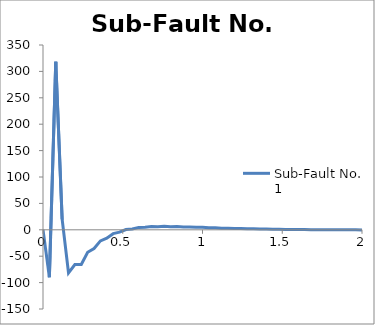
| Category | Sub-Fault No.  1 |
|---|---|
| 0.0 | 0 |
| 0.04 | -89.864 |
| 0.08 | 318.28 |
| 0.12 | 20.042 |
| 0.16 | -81.64 |
| 0.2 | -65.915 |
| 0.24 | -65.609 |
| 0.28 | -42.628 |
| 0.32 | -35.382 |
| 0.36 | -20.973 |
| 0.4 | -15.879 |
| 0.44 | -7.307 |
| 0.48 | -4.512 |
| 0.52 | 0.495 |
| 0.56 | 1.69 |
| 0.6 | 4.524 |
| 0.64 | 4.723 |
| 0.68 | 6.241 |
| 0.72 | 5.871 |
| 0.76 | 6.609 |
| 0.8 | 5.95 |
| 0.84 | 6.24 |
| 0.88 | 5.467 |
| 0.92 | 5.516 |
| 0.96 | 4.732 |
| 1.0 | 4.664 |
| 1.04 | 3.927 |
| 1.08 | 3.814 |
| 1.12 | 3.151 |
| 1.16 | 3.034 |
| 1.2 | 2.454 |
| 1.24 | 2.354 |
| 1.28 | 1.857 |
| 1.32 | 1.782 |
| 1.36 | 1.361 |
| 1.4 | 1.313 |
| 1.44 | 0.96 |
| 1.48 | 0.937 |
| 1.52 | 0.643 |
| 1.56 | 0.642 |
| 1.6 | 0.397 |
| 1.64 | 0.415 |
| 1.68 | 0.211 |
| 1.72 | 0.242 |
| 1.76 | 0.072 |
| 1.8 | 0.113 |
| 1.84 | -0.029 |
| 1.88 | 0.02 |
| 1.92 | -0.101 |
| 1.96 | -0.046 |
| 2.0 | -0.149 |
| 2.04 | -0.092 |
| 2.08 | -0.179 |
| 2.12 | -0.121 |
| 2.16 | -0.197 |
| 2.2 | -0.138 |
| 2.24 | -0.205 |
| 2.28 | -0.147 |
| 2.32 | -0.206 |
| 2.36 | -0.149 |
| 2.4 | -0.202 |
| 2.44 | -0.147 |
| 2.48 | -0.194 |
| 2.52 | -0.142 |
| 2.56 | -0.185 |
| 2.6 | -0.135 |
| 2.64 | -0.174 |
| 2.68 | -0.127 |
| 2.72 | -0.163 |
| 2.76 | -0.118 |
| 2.8 | -0.151 |
| 2.84 | -0.108 |
| 2.88 | -0.14 |
| 2.92 | -0.099 |
| 2.96 | -0.129 |
| 3.0 | -0.09 |
| 3.04 | -0.118 |
| 3.08 | -0.082 |
| 3.12 | -0.108 |
| 3.16 | -0.074 |
| 3.2 | -0.099 |
| 3.24 | -0.066 |
| 3.28 | -0.09 |
| 3.32 | -0.06 |
| 3.36 | -0.082 |
| 3.4 | -0.053 |
| 3.44 | -0.075 |
| 3.48 | -0.047 |
| 3.52 | -0.068 |
| 3.56 | -0.042 |
| 3.6 | -0.062 |
| 3.64 | -0.037 |
| 3.68 | -0.056 |
| 3.72 | -0.033 |
| 3.76 | -0.051 |
| 3.8 | -0.029 |
| 3.84 | -0.047 |
| 3.88 | -0.025 |
| 3.92 | -0.042 |
| 3.96 | -0.022 |
| 4.0 | -0.038 |
| 4.04 | -0.019 |
| 4.08 | -0.035 |
| 4.12 | -0.017 |
| 4.16 | -0.032 |
| 4.2 | -0.014 |
| 4.24 | -0.029 |
| 4.28 | -0.012 |
| 4.32 | -0.026 |
| 4.36 | -0.011 |
| 4.4 | -0.024 |
| 4.44 | -0.009 |
| 4.48 | -0.022 |
| 4.52 | -0.007 |
| 4.56 | -0.02 |
| 4.6 | -0.006 |
| 4.64 | -0.018 |
| 4.68 | -0.005 |
| 4.72 | -0.016 |
| 4.76 | 0 |
| 4.8 | 0 |
| 4.84 | 0 |
| 4.88 | 0 |
| 4.92 | 0 |
| 4.96 | 0 |
| 5.0 | 0 |
| 5.04 | 0 |
| 5.08 | 0 |
| 5.12 | 0 |
| 5.16 | 0 |
| 5.2 | 0 |
| 5.24 | 0 |
| 5.28 | 0 |
| 5.32 | 0 |
| 5.36 | 0 |
| 5.4 | 0 |
| 5.44 | 0 |
| 5.48 | 0 |
| 5.52 | 0 |
| 5.56 | 0 |
| 5.6 | 0 |
| 5.64 | 0 |
| 5.68 | 0 |
| 5.72 | 0 |
| 5.76 | 0 |
| 5.8 | 0 |
| 5.84 | 0 |
| 5.88 | 0 |
| 5.92 | 0 |
| 5.96 | 0 |
| 6.0 | 0 |
| 6.04 | 0 |
| 6.08 | 0 |
| 6.12 | 0 |
| 6.16 | 0 |
| 6.2 | 0 |
| 6.24 | 0 |
| 6.28 | 0 |
| 6.32 | 0 |
| 6.36 | 0 |
| 6.4 | 0 |
| 6.44 | 0 |
| 6.48 | 0 |
| 6.52 | 0 |
| 6.56 | 0 |
| 6.6 | 0 |
| 6.64 | 0 |
| 6.68 | 0 |
| 6.72 | 0 |
| 6.76 | 0 |
| 6.8 | 0 |
| 6.84 | 0 |
| 6.88 | 0 |
| 6.92 | 0 |
| 6.96 | 0 |
| 7.0 | 0 |
| 7.04 | 0 |
| 7.08 | 0 |
| 7.12 | 0 |
| 7.16 | 0 |
| 7.2 | 0 |
| 7.24 | 0 |
| 7.28 | 0 |
| 7.32 | 0 |
| 7.36 | 0 |
| 7.4 | 0 |
| 7.44 | 0 |
| 7.48 | 0 |
| 7.52 | 0 |
| 7.56 | 0 |
| 7.6 | 0 |
| 7.64 | 0 |
| 7.68 | 0 |
| 7.72 | 0 |
| 7.76 | 0 |
| 7.8 | 0 |
| 7.84 | 0 |
| 7.88 | 0 |
| 7.92 | 0 |
| 7.96 | 0 |
| 8.0 | 0 |
| 8.04 | 0 |
| 8.08 | 0 |
| 8.12 | 0 |
| 8.16 | 0 |
| 8.2 | 0 |
| 8.24 | 0 |
| 8.28 | 0 |
| 8.32 | 0 |
| 8.36 | 0 |
| 8.4 | 0 |
| 8.44 | 0 |
| 8.48 | 0 |
| 8.52 | 0 |
| 8.56 | 0 |
| 8.6 | 0 |
| 8.64 | 0 |
| 8.68 | 0 |
| 8.72 | 0 |
| 8.76 | 0 |
| 8.8 | 0 |
| 8.84 | 0 |
| 8.88 | 0 |
| 8.92 | 0 |
| 8.96 | 0 |
| 9.0 | 0 |
| 9.04 | 0 |
| 9.08 | 0 |
| 9.12 | 0 |
| 9.16 | 0 |
| 9.2 | 0 |
| 9.24 | 0 |
| 9.28 | 0 |
| 9.32 | 0 |
| 9.36 | 0 |
| 9.4 | 0 |
| 9.44 | 0 |
| 9.48 | 0 |
| 9.52 | 0 |
| 9.56 | 0 |
| 9.6 | 0 |
| 9.64 | 0 |
| 9.68 | 0 |
| 9.72 | 0 |
| 9.76 | 0 |
| 9.8 | 0 |
| 9.84 | 0 |
| 9.88 | 0 |
| 9.92 | 0 |
| 9.96 | 0 |
| 10.0 | 0 |
| 10.04 | 0 |
| 10.08 | 0 |
| 10.12 | 0 |
| 10.16 | 0 |
| 10.2 | 0 |
| 10.24 | 0 |
| 10.28 | 0 |
| 10.32 | 0 |
| 10.36 | 0 |
| 10.4 | 0 |
| 10.44 | 0 |
| 10.48 | 0 |
| 10.52 | 0 |
| 10.56 | 0 |
| 10.6 | 0 |
| 10.64 | 0 |
| 10.68 | 0 |
| 10.72 | 0 |
| 10.76 | 0 |
| 10.8 | 0 |
| 10.84 | 0 |
| 10.88 | 0 |
| 10.92 | 0 |
| 10.96 | 0 |
| 11.0 | 0 |
| 11.04 | 0 |
| 11.08 | 0 |
| 11.12 | 0 |
| 11.16 | 0 |
| 11.2 | 0 |
| 11.24 | 0 |
| 11.28 | 0 |
| 11.32 | 0 |
| 11.36 | 0 |
| 11.4 | 0 |
| 11.44 | 0 |
| 11.48 | 0 |
| 11.52 | 0 |
| 11.56 | 0 |
| 11.6 | 0 |
| 11.64 | 0 |
| 11.68 | 0 |
| 11.72 | 0 |
| 11.76 | 0 |
| 11.8 | 0 |
| 11.84 | 0 |
| 11.88 | 0 |
| 11.92 | 0 |
| 11.96 | 0 |
| 12.0 | 0 |
| 12.04 | 0 |
| 12.08 | 0 |
| 12.12 | 0 |
| 12.16 | 0 |
| 12.2 | 0 |
| 12.24 | 0 |
| 12.28 | 0 |
| 12.32 | 0 |
| 12.36 | 0 |
| 12.4 | 0 |
| 12.44 | 0 |
| 12.48 | 0 |
| 12.52 | 0 |
| 12.56 | 0 |
| 12.6 | 0 |
| 12.64 | 0 |
| 12.68 | 0 |
| 12.72 | 0 |
| 12.76 | 0 |
| 12.8 | 0 |
| 12.84 | 0 |
| 12.88 | 0 |
| 12.92 | 0 |
| 12.96 | 0 |
| 13.0 | 0 |
| 13.04 | 0 |
| 13.08 | 0 |
| 13.12 | 0 |
| 13.16 | 0 |
| 13.2 | 0 |
| 13.24 | 0 |
| 13.28 | 0 |
| 13.32 | 0 |
| 13.36 | 0 |
| 13.4 | 0 |
| 13.44 | 0 |
| 13.48 | 0 |
| 13.52 | 0 |
| 13.56 | 0 |
| 13.6 | 0 |
| 13.64 | 0 |
| 13.68 | 0 |
| 13.72 | 0 |
| 13.76 | 0 |
| 13.8 | 0 |
| 13.84 | 0 |
| 13.88 | 0 |
| 13.92 | 0 |
| 13.96 | 0 |
| 14.0 | 0 |
| 14.04 | 0 |
| 14.08 | 0 |
| 14.12 | 0 |
| 14.16 | 0 |
| 14.2 | 0 |
| 14.24 | 0 |
| 14.28 | 0 |
| 14.32 | 0 |
| 14.36 | 0 |
| 14.4 | 0 |
| 14.44 | 0 |
| 14.48 | 0 |
| 14.52 | 0 |
| 14.56 | 0 |
| 14.6 | 0 |
| 14.64 | 0 |
| 14.68 | 0 |
| 14.72 | 0 |
| 14.76 | 0 |
| 14.8 | 0 |
| 14.84 | 0 |
| 14.88 | 0 |
| 14.92 | 0 |
| 14.96 | 0 |
| 15.0 | 0 |
| 15.04 | 0 |
| 15.08 | 0 |
| 15.12 | 0 |
| 15.16 | 0 |
| 15.2 | 0 |
| 15.24 | 0 |
| 15.28 | 0 |
| 15.32 | 0 |
| 15.36 | 0 |
| 15.4 | 0 |
| 15.44 | 0 |
| 15.48 | 0 |
| 15.52 | 0 |
| 15.56 | 0 |
| 15.6 | 0 |
| 15.64 | 0 |
| 15.68 | 0 |
| 15.72 | 0 |
| 15.76 | 0 |
| 15.8 | 0 |
| 15.84 | 0 |
| 15.88 | 0 |
| 15.92 | 0 |
| 15.96 | 0 |
| 16.0 | 0 |
| 16.04 | 0 |
| 16.08 | 0 |
| 16.12 | 0 |
| 16.16 | 0 |
| 16.2 | 0 |
| 16.24 | 0 |
| 16.28 | 0 |
| 16.32 | 0 |
| 16.36 | 0 |
| 16.4 | 0 |
| 16.44 | 0 |
| 16.48 | 0 |
| 16.52 | 0 |
| 16.56 | 0 |
| 16.6 | 0 |
| 16.64 | 0 |
| 16.68 | 0 |
| 16.72 | 0 |
| 16.76 | 0 |
| 16.8 | 0 |
| 16.84 | 0 |
| 16.88 | 0 |
| 16.92 | 0 |
| 16.96 | 0 |
| 17.0 | 0 |
| 17.04 | 0 |
| 17.08 | 0 |
| 17.12 | 0 |
| 17.16 | 0 |
| 17.2 | 0 |
| 17.24 | 0 |
| 17.28 | 0 |
| 17.32 | 0 |
| 17.36 | 0 |
| 17.4 | 0 |
| 17.44 | 0 |
| 17.48 | 0 |
| 17.52 | 0 |
| 17.56 | 0 |
| 17.6 | 0 |
| 17.64 | 0 |
| 17.68 | 0 |
| 17.72 | 0 |
| 17.76 | 0 |
| 17.8 | 0 |
| 17.84 | 0 |
| 17.88 | 0 |
| 17.92 | 0 |
| 17.96 | 0 |
| 18.0 | 0 |
| 18.04 | 0 |
| 18.08 | 0 |
| 18.12 | 0 |
| 18.16 | 0 |
| 18.2 | 0 |
| 18.24 | 0 |
| 18.28 | 0 |
| 18.32 | 0 |
| 18.36 | 0 |
| 18.4 | 0 |
| 18.44 | 0 |
| 18.48 | 0 |
| 18.52 | 0 |
| 18.56 | 0 |
| 18.6 | 0 |
| 18.64 | 0 |
| 18.68 | 0 |
| 18.72 | 0 |
| 18.76 | 0 |
| 18.8 | 0 |
| 18.84 | 0 |
| 18.88 | 0 |
| 18.92 | 0 |
| 18.96 | 0 |
| 19.0 | 0 |
| 19.04 | 0 |
| 19.08 | 0 |
| 19.12 | 0 |
| 19.16 | 0 |
| 19.2 | 0 |
| 19.24 | 0 |
| 19.28 | 0 |
| 19.32 | 0 |
| 19.36 | 0 |
| 19.4 | 0 |
| 19.44 | 0 |
| 19.48 | 0 |
| 19.52 | 0 |
| 19.56 | 0 |
| 19.6 | 0 |
| 19.64 | 0 |
| 19.68 | 0 |
| 19.72 | 0 |
| 19.76 | 0 |
| 19.8 | 0 |
| 19.84 | 0 |
| 19.88 | 0 |
| 19.92 | 0 |
| 19.96 | 0 |
| 20.0 | 0 |
| 20.04 | 0 |
| 20.08 | 0 |
| 20.12 | 0 |
| 20.16 | 0 |
| 20.2 | 0 |
| 20.24 | 0 |
| 20.28 | 0 |
| 20.32 | 0 |
| 20.36 | 0 |
| 20.4 | 0 |
| 20.44 | 0 |
| 20.48 | 0 |
| 20.52 | 0 |
| 20.56 | 0 |
| 20.6 | 0 |
| 20.64 | 0 |
| 20.68 | 0 |
| 20.72 | 0 |
| 20.76 | 0 |
| 20.8 | 0 |
| 20.84 | 0 |
| 20.88 | 0 |
| 20.92 | 0 |
| 20.96 | 0 |
| 21.0 | 0 |
| 21.04 | 0 |
| 21.08 | 0 |
| 21.12 | 0 |
| 21.16 | 0 |
| 21.2 | 0 |
| 21.24 | 0 |
| 21.28 | 0 |
| 21.32 | 0 |
| 21.36 | 0 |
| 21.4 | 0 |
| 21.44 | 0 |
| 21.48 | 0 |
| 21.52 | 0 |
| 21.56 | 0 |
| 21.6 | 0 |
| 21.64 | 0 |
| 21.68 | 0 |
| 21.72 | 0 |
| 21.76 | 0 |
| 21.8 | 0 |
| 21.84 | 0 |
| 21.88 | 0 |
| 21.92 | 0 |
| 21.96 | 0 |
| 22.0 | 0 |
| 22.04 | 0 |
| 22.08 | 0 |
| 22.12 | 0 |
| 22.16 | 0 |
| 22.2 | 0 |
| 22.24 | 0 |
| 22.28 | 0 |
| 22.32 | 0 |
| 22.36 | 0 |
| 22.4 | 0 |
| 22.44 | 0 |
| 22.48 | 0 |
| 22.52 | 0 |
| 22.56 | 0 |
| 22.6 | 0 |
| 22.64 | 0 |
| 22.68 | 0 |
| 22.72 | 0 |
| 22.76 | 0 |
| 22.8 | 0 |
| 22.84 | 0 |
| 22.88 | 0 |
| 22.92 | 0 |
| 22.96 | 0 |
| 23.0 | 0 |
| 23.04 | 0 |
| 23.08 | 0 |
| 23.12 | 0 |
| 23.16 | 0 |
| 23.2 | 0 |
| 23.24 | 0 |
| 23.28 | 0 |
| 23.32 | 0 |
| 23.36 | 0 |
| 23.4 | 0 |
| 23.44 | 0 |
| 23.48 | 0 |
| 23.52 | 0 |
| 23.56 | 0 |
| 23.6 | 0 |
| 23.64 | 0 |
| 23.68 | 0 |
| 23.72 | 0 |
| 23.76 | 0 |
| 23.8 | 0 |
| 23.84 | 0 |
| 23.88 | 0 |
| 23.92 | 0 |
| 23.96 | 0 |
| 24.0 | 0 |
| 24.04 | 0 |
| 24.08 | 0 |
| 24.12 | 0 |
| 24.16 | 0 |
| 24.2 | 0 |
| 24.24 | 0 |
| 24.28 | 0 |
| 24.32 | 0 |
| 24.36 | 0 |
| 24.4 | 0 |
| 24.44 | 0 |
| 24.48 | 0 |
| 24.52 | 0 |
| 24.56 | 0 |
| 24.6 | 0 |
| 24.64 | 0 |
| 24.68 | 0 |
| 24.72 | 0 |
| 24.76 | 0 |
| 24.8 | 0 |
| 24.84 | 0 |
| 24.88 | 0 |
| 24.92 | 0 |
| 24.96 | 0 |
| 25.0 | 0 |
| 25.04 | 0 |
| 25.08 | 0 |
| 25.12 | 0 |
| 25.16 | 0 |
| 25.2 | 0 |
| 25.24 | 0 |
| 25.28 | 0 |
| 25.32 | 0 |
| 25.36 | 0 |
| 25.4 | 0 |
| 25.44 | 0 |
| 25.48 | 0 |
| 25.52 | 0 |
| 25.56 | 0 |
| 25.6 | 0 |
| 25.64 | 0 |
| 25.68 | 0 |
| 25.72 | 0 |
| 25.76 | 0 |
| 25.8 | 0 |
| 25.84 | 0 |
| 25.88 | 0 |
| 25.92 | 0 |
| 25.96 | 0 |
| 26.0 | 0 |
| 26.04 | 0 |
| 26.08 | 0 |
| 26.12 | 0 |
| 26.16 | 0 |
| 26.2 | 0 |
| 26.24 | 0 |
| 26.28 | 0 |
| 26.32 | 0 |
| 26.36 | 0 |
| 26.4 | 0 |
| 26.44 | 0 |
| 26.48 | 0 |
| 26.52 | 0 |
| 26.56 | 0 |
| 26.6 | 0 |
| 26.64 | 0 |
| 26.68 | 0 |
| 26.72 | 0 |
| 26.76 | 0 |
| 26.8 | 0 |
| 26.84 | 0 |
| 26.88 | 0 |
| 26.92 | 0 |
| 26.96 | 0 |
| 27.0 | 0 |
| 27.04 | 0 |
| 27.08 | 0 |
| 27.12 | 0 |
| 27.16 | 0 |
| 27.2 | 0 |
| 27.24 | 0 |
| 27.28 | 0 |
| 27.32 | 0 |
| 27.36 | 0 |
| 27.4 | 0 |
| 27.44 | 0 |
| 27.48 | 0 |
| 27.52 | 0 |
| 27.56 | 0 |
| 27.6 | 0 |
| 27.64 | 0 |
| 27.68 | 0 |
| 27.72 | 0 |
| 27.76 | 0 |
| 27.8 | 0 |
| 27.84 | 0 |
| 27.88 | 0 |
| 27.92 | 0 |
| 27.96 | 0 |
| 28.0 | 0 |
| 28.04 | 0 |
| 28.08 | 0 |
| 28.12 | 0 |
| 28.16 | 0 |
| 28.2 | 0 |
| 28.24 | 0 |
| 28.28 | 0 |
| 28.32 | 0 |
| 28.36 | 0 |
| 28.4 | 0 |
| 28.44 | 0 |
| 28.48 | 0 |
| 28.52 | 0 |
| 28.56 | 0 |
| 28.6 | 0 |
| 28.64 | 0 |
| 28.68 | 0 |
| 28.72 | 0 |
| 28.76 | 0 |
| 28.8 | 0 |
| 28.84 | 0 |
| 28.88 | 0 |
| 28.92 | 0 |
| 28.96 | 0 |
| 29.0 | 0 |
| 29.04 | 0 |
| 29.08 | 0 |
| 29.12 | 0 |
| 29.16 | 0 |
| 29.2 | 0 |
| 29.24 | 0 |
| 29.28 | 0 |
| 29.32 | 0 |
| 29.36 | 0 |
| 29.4 | 0 |
| 29.44 | 0 |
| 29.48 | 0 |
| 29.52 | 0 |
| 29.56 | 0 |
| 29.6 | 0 |
| 29.64 | 0 |
| 29.68 | 0 |
| 29.72 | 0 |
| 29.76 | 0 |
| 29.8 | 0 |
| 29.84 | 0 |
| 29.88 | 0 |
| 29.92 | 0 |
| 29.96 | 0 |
| 30.0 | 0 |
| 30.04 | 0 |
| 30.08 | 0 |
| 30.12 | 0 |
| 30.16 | 0 |
| 30.2 | 0 |
| 30.24 | 0 |
| 30.28 | 0 |
| 30.32 | 0 |
| 30.36 | 0 |
| 30.4 | 0 |
| 30.44 | 0 |
| 30.48 | 0 |
| 30.52 | 0 |
| 30.56 | 0 |
| 30.6 | 0 |
| 30.64 | 0 |
| 30.68 | 0 |
| 30.72 | 0 |
| 30.76 | 0 |
| 30.8 | 0 |
| 30.84 | 0 |
| 30.88 | 0 |
| 30.92 | 0 |
| 30.96 | 0 |
| 31.0 | 0 |
| 31.04 | 0 |
| 31.08 | 0 |
| 31.12 | 0 |
| 31.16 | 0 |
| 31.2 | 0 |
| 31.24 | 0 |
| 31.28 | 0 |
| 31.32 | 0 |
| 31.36 | 0 |
| 31.4 | 0 |
| 31.44 | 0 |
| 31.48 | 0 |
| 31.52 | 0 |
| 31.56 | 0 |
| 31.6 | 0 |
| 31.64 | 0 |
| 31.68 | 0 |
| 31.72 | 0 |
| 31.76 | 0 |
| 31.8 | 0 |
| 31.84 | 0 |
| 31.88 | 0 |
| 31.92 | 0 |
| 31.96 | 0 |
| 32.0 | 0 |
| 32.04 | 0 |
| 32.08 | 0 |
| 32.12 | 0 |
| 32.16 | 0 |
| 32.2 | 0 |
| 32.24 | 0 |
| 32.28 | 0 |
| 32.32 | 0 |
| 32.36 | 0 |
| 32.4 | 0 |
| 32.44 | 0 |
| 32.48 | 0 |
| 32.52 | 0 |
| 32.56 | 0 |
| 32.6 | 0 |
| 32.64 | 0 |
| 32.68 | 0 |
| 32.72 | 0 |
| 32.76 | 0 |
| 32.8 | 0 |
| 32.84 | 0 |
| 32.88 | 0 |
| 32.92 | 0 |
| 32.96 | 0 |
| 33.0 | 0 |
| 33.04 | 0 |
| 33.08 | 0 |
| 33.12 | 0 |
| 33.16 | 0 |
| 33.2 | 0 |
| 33.24 | 0 |
| 33.28 | 0 |
| 33.32 | 0 |
| 33.36 | 0 |
| 33.4 | 0 |
| 33.44 | 0 |
| 33.48 | 0 |
| 33.52 | 0 |
| 33.56 | 0 |
| 33.6 | 0 |
| 33.64 | 0 |
| 33.68 | 0 |
| 33.72 | 0 |
| 33.76 | 0 |
| 33.8 | 0 |
| 33.84 | 0 |
| 33.88 | 0 |
| 33.92 | 0 |
| 33.96 | 0 |
| 34.0 | 0 |
| 34.04 | 0 |
| 34.08 | 0 |
| 34.12 | 0 |
| 34.16 | 0 |
| 34.2 | 0 |
| 34.24 | 0 |
| 34.28 | 0 |
| 34.32 | 0 |
| 34.36 | 0 |
| 34.4 | 0 |
| 34.44 | 0 |
| 34.48 | 0 |
| 34.52 | 0 |
| 34.56 | 0 |
| 34.6 | 0 |
| 34.64 | 0 |
| 34.68 | 0 |
| 34.72 | 0 |
| 34.76 | 0 |
| 34.8 | 0 |
| 34.84 | 0 |
| 34.88 | 0 |
| 34.92 | 0 |
| 34.96 | 0 |
| 35.0 | 0 |
| 35.04 | 0 |
| 35.08 | 0 |
| 35.12 | 0 |
| 35.16 | 0 |
| 35.2 | 0 |
| 35.24 | 0 |
| 35.28 | 0 |
| 35.32 | 0 |
| 35.36 | 0 |
| 35.4 | 0 |
| 35.44 | 0 |
| 35.48 | 0 |
| 35.52 | 0 |
| 35.56 | 0 |
| 35.6 | 0 |
| 35.64 | 0 |
| 35.68 | 0 |
| 35.72 | 0 |
| 35.76 | 0 |
| 35.8 | 0 |
| 35.84 | 0 |
| 35.88 | 0 |
| 35.92 | 0 |
| 35.96 | 0 |
| 36.0 | 0 |
| 36.04 | 0 |
| 36.08 | 0 |
| 36.12 | 0 |
| 36.16 | 0 |
| 36.2 | 0 |
| 36.24 | 0 |
| 36.28 | 0 |
| 36.32 | 0 |
| 36.36 | 0 |
| 36.4 | 0 |
| 36.44 | 0 |
| 36.48 | 0 |
| 36.52 | 0 |
| 36.56 | 0 |
| 36.6 | 0 |
| 36.64 | 0 |
| 36.68 | 0 |
| 36.72 | 0 |
| 36.76 | 0 |
| 36.8 | 0 |
| 36.84 | 0 |
| 36.88 | 0 |
| 36.92 | 0 |
| 36.96 | 0 |
| 37.0 | 0 |
| 37.04 | 0 |
| 37.08 | 0 |
| 37.12 | 0 |
| 37.16 | 0 |
| 37.2 | 0 |
| 37.24 | 0 |
| 37.28 | 0 |
| 37.32 | 0 |
| 37.36 | 0 |
| 37.4 | 0 |
| 37.44 | 0 |
| 37.48 | 0 |
| 37.52 | 0 |
| 37.56 | 0 |
| 37.6 | 0 |
| 37.64 | 0 |
| 37.68 | 0 |
| 37.72 | 0 |
| 37.76 | 0 |
| 37.8 | 0 |
| 37.84 | 0 |
| 37.88 | 0 |
| 37.92 | 0 |
| 37.96 | 0 |
| 38.0 | 0 |
| 38.04 | 0 |
| 38.08 | 0 |
| 38.12 | 0 |
| 38.16 | 0 |
| 38.2 | 0 |
| 38.24 | 0 |
| 38.28 | 0 |
| 38.32 | 0 |
| 38.36 | 0 |
| 38.4 | 0 |
| 38.44 | 0 |
| 38.48 | 0 |
| 38.52 | 0 |
| 38.56 | 0 |
| 38.6 | 0 |
| 38.64 | 0 |
| 38.68 | 0 |
| 38.72 | 0 |
| 38.76 | 0 |
| 38.8 | 0 |
| 38.84 | 0 |
| 38.88 | 0 |
| 38.92 | 0 |
| 38.96 | 0 |
| 39.0 | 0 |
| 39.04 | 0 |
| 39.08 | 0 |
| 39.12 | 0 |
| 39.16 | 0 |
| 39.2 | 0 |
| 39.24 | 0 |
| 39.28 | 0 |
| 39.32 | 0 |
| 39.36 | 0 |
| 39.4 | 0 |
| 39.44 | 0 |
| 39.48 | 0 |
| 39.52 | 0 |
| 39.56 | 0 |
| 39.6 | 0 |
| 39.64 | 0 |
| 39.68 | 0 |
| 39.72 | 0 |
| 39.76 | 0 |
| 39.8 | 0 |
| 39.84 | 0 |
| 39.88 | 0 |
| 39.92 | 0 |
| 39.96 | 0 |
| 40.0 | 0 |
| 40.04 | 0 |
| 40.08 | 0 |
| 40.12 | 0 |
| 40.16 | 0 |
| 40.2 | 0 |
| 40.24 | 0 |
| 40.28 | 0 |
| 40.32 | 0 |
| 40.36 | 0 |
| 40.4 | 0 |
| 40.44 | 0 |
| 40.48 | 0 |
| 40.52 | 0 |
| 40.56 | 0 |
| 40.6 | 0 |
| 40.64 | 0 |
| 40.68 | 0 |
| 40.72 | 0 |
| 40.76 | 0 |
| 40.8 | 0 |
| 40.84 | 0 |
| 40.88 | 0 |
| 40.92 | 0 |
| 40.96 | 0 |
| 41.0 | 0 |
| 41.04 | 0 |
| 41.08 | 0 |
| 41.12 | 0 |
| 41.16 | 0 |
| 41.2 | 0 |
| 41.24 | 0 |
| 41.28 | 0 |
| 41.32 | 0 |
| 41.36 | 0 |
| 41.4 | 0 |
| 41.44 | 0 |
| 41.48 | 0 |
| 41.52 | 0 |
| 41.56 | 0 |
| 41.6 | 0 |
| 41.64 | 0 |
| 41.68 | 0 |
| 41.72 | 0 |
| 41.76 | 0 |
| 41.8 | 0 |
| 41.84 | 0 |
| 41.88 | 0 |
| 41.92 | 0 |
| 41.96 | 0 |
| 42.0 | 0 |
| 42.04 | 0 |
| 42.08 | 0 |
| 42.12 | 0 |
| 42.16 | 0 |
| 42.2 | 0 |
| 42.24 | 0 |
| 42.28 | 0 |
| 42.32 | 0 |
| 42.36 | 0 |
| 42.4 | 0 |
| 42.44 | 0 |
| 42.48 | 0 |
| 42.52 | 0 |
| 42.56 | 0 |
| 42.6 | 0 |
| 42.64 | 0 |
| 42.68 | 0 |
| 42.72 | 0 |
| 42.76 | 0 |
| 42.8 | 0 |
| 42.84 | 0 |
| 42.88 | 0 |
| 42.92 | 0 |
| 42.96 | 0 |
| 43.0 | 0 |
| 43.04 | 0 |
| 43.08 | 0 |
| 43.12 | 0 |
| 43.16 | 0 |
| 43.2 | 0 |
| 43.24 | 0 |
| 43.28 | 0 |
| 43.32 | 0 |
| 43.36 | 0 |
| 43.4 | 0 |
| 43.44 | 0 |
| 43.48 | 0 |
| 43.52 | 0 |
| 43.56 | 0 |
| 43.6 | 0 |
| 43.64 | 0 |
| 43.68 | 0 |
| 43.72 | 0 |
| 43.76 | 0 |
| 43.8 | 0 |
| 43.84 | 0 |
| 43.88 | 0 |
| 43.92 | 0 |
| 43.96 | 0 |
| 44.0 | 0 |
| 44.04 | 0 |
| 44.08 | 0 |
| 44.12 | 0 |
| 44.16 | 0 |
| 44.2 | 0 |
| 44.24 | 0 |
| 44.28 | 0 |
| 44.32 | 0 |
| 44.36 | 0 |
| 44.4 | 0 |
| 44.44 | 0 |
| 44.48 | 0 |
| 44.52 | 0 |
| 44.56 | 0 |
| 44.6 | 0 |
| 44.64 | 0 |
| 44.68 | 0 |
| 44.72 | 0 |
| 44.76 | 0 |
| 44.8 | 0 |
| 44.84 | 0 |
| 44.88 | 0 |
| 44.92 | 0 |
| 44.96 | 0 |
| 45.0 | 0 |
| 45.04 | 0 |
| 45.08 | 0 |
| 45.12 | 0 |
| 45.16 | 0 |
| 45.2 | 0 |
| 45.24 | 0 |
| 45.28 | 0 |
| 45.32 | 0 |
| 45.36 | 0 |
| 45.4 | 0 |
| 45.44 | 0 |
| 45.48 | 0 |
| 45.52 | 0 |
| 45.56 | 0 |
| 45.6 | 0 |
| 45.64 | 0 |
| 45.68 | 0 |
| 45.72 | 0 |
| 45.76 | 0 |
| 45.8 | 0 |
| 45.84 | 0 |
| 45.88 | 0 |
| 45.92 | 0 |
| 45.96 | 0 |
| 46.0 | 0 |
| 46.04 | 0 |
| 46.08 | 0 |
| 46.12 | 0 |
| 46.16 | 0 |
| 46.2 | 0 |
| 46.24 | 0 |
| 46.28 | 0 |
| 46.32 | 0 |
| 46.36 | 0 |
| 46.4 | 0 |
| 46.44 | 0 |
| 46.48 | 0 |
| 46.52 | 0 |
| 46.56 | 0 |
| 46.6 | 0 |
| 46.64 | 0 |
| 46.68 | 0 |
| 46.72 | 0 |
| 46.76 | 0 |
| 46.8 | 0 |
| 46.84 | 0 |
| 46.88 | 0 |
| 46.92 | 0 |
| 46.96 | 0 |
| 47.0 | 0 |
| 47.04 | 0 |
| 47.08 | 0 |
| 47.12 | 0 |
| 47.16 | 0 |
| 47.2 | 0 |
| 47.24 | 0 |
| 47.28 | 0 |
| 47.32 | 0 |
| 47.36 | 0 |
| 47.4 | 0 |
| 47.44 | 0 |
| 47.48 | 0 |
| 47.52 | 0 |
| 47.56 | 0 |
| 47.6 | 0 |
| 47.64 | 0 |
| 47.68 | 0 |
| 47.72 | 0 |
| 47.76 | 0 |
| 47.8 | 0 |
| 47.84 | 0 |
| 47.88 | 0 |
| 47.92 | 0 |
| 47.96 | 0 |
| 48.0 | 0 |
| 48.04 | 0 |
| 48.08 | 0 |
| 48.12 | 0 |
| 48.16 | 0 |
| 48.2 | 0 |
| 48.24 | 0 |
| 48.28 | 0 |
| 48.32 | 0 |
| 48.36 | 0 |
| 48.4 | 0 |
| 48.44 | 0 |
| 48.48 | 0 |
| 48.52 | 0 |
| 48.56 | 0 |
| 48.6 | 0 |
| 48.64 | 0 |
| 48.68 | 0 |
| 48.72 | 0 |
| 48.76 | 0 |
| 48.8 | 0 |
| 48.84 | 0 |
| 48.88 | 0 |
| 48.92 | 0 |
| 48.96 | 0 |
| 49.0 | 0 |
| 49.04 | 0 |
| 49.08 | 0 |
| 49.12 | 0 |
| 49.16 | 0 |
| 49.2 | 0 |
| 49.24 | 0 |
| 49.28 | 0 |
| 49.32 | 0 |
| 49.36 | 0 |
| 49.4 | 0 |
| 49.44 | 0 |
| 49.48 | 0 |
| 49.52 | 0 |
| 49.56 | 0 |
| 49.6 | 0 |
| 49.64 | 0 |
| 49.68 | 0 |
| 49.72 | 0 |
| 49.76 | 0 |
| 49.8 | 0 |
| 49.84 | 0 |
| 49.88 | 0 |
| 49.92 | 0 |
| 49.96 | 0 |
| 50.0 | 0 |
| 50.04 | 0 |
| 50.08 | 0 |
| 50.12 | 0 |
| 50.16 | 0 |
| 50.2 | 0 |
| 50.24 | 0 |
| 50.28 | 0 |
| 50.32 | 0 |
| 50.36 | 0 |
| 50.4 | 0 |
| 50.44 | 0 |
| 50.48 | 0 |
| 50.52 | 0 |
| 50.56 | 0 |
| 50.6 | 0 |
| 50.64 | 0 |
| 50.68 | 0 |
| 50.72 | 0 |
| 50.76 | 0 |
| 50.8 | 0 |
| 50.84 | 0 |
| 50.88 | 0 |
| 50.92 | 0 |
| 50.96 | 0 |
| 51.0 | 0 |
| 51.04 | 0 |
| 51.08 | 0 |
| 51.12 | 0 |
| 51.16 | 0 |
| 51.2 | 0 |
| 51.24 | 0 |
| 51.28 | 0 |
| 51.32 | 0 |
| 51.36 | 0 |
| 51.4 | 0 |
| 51.44 | 0 |
| 51.48 | 0 |
| 51.52 | 0 |
| 51.56 | 0 |
| 51.6 | 0 |
| 51.64 | 0 |
| 51.68 | 0 |
| 51.72 | 0 |
| 51.76 | 0 |
| 51.8 | 0 |
| 51.84 | 0 |
| 51.88 | 0 |
| 51.92 | 0 |
| 51.96 | 0 |
| 52.0 | 0 |
| 52.04 | 0 |
| 52.08 | 0 |
| 52.12 | 0 |
| 52.16 | 0 |
| 52.2 | 0 |
| 52.24 | 0 |
| 52.28 | 0 |
| 52.32 | 0 |
| 52.36 | 0 |
| 52.4 | 0 |
| 52.44 | 0 |
| 52.48 | 0 |
| 52.52 | 0 |
| 52.56 | 0 |
| 52.6 | 0 |
| 52.64 | 0 |
| 52.68 | 0 |
| 52.72 | 0 |
| 52.76 | 0 |
| 52.8 | 0 |
| 52.84 | 0 |
| 52.88 | 0 |
| 52.92 | 0 |
| 52.96 | 0 |
| 53.0 | 0 |
| 53.04 | 0 |
| 53.08 | 0 |
| 53.12 | 0 |
| 53.16 | 0 |
| 53.2 | 0 |
| 53.24 | 0 |
| 53.28 | 0 |
| 53.32 | 0 |
| 53.36 | 0 |
| 53.4 | 0 |
| 53.44 | 0 |
| 53.48 | 0 |
| 53.52 | 0 |
| 53.56 | 0 |
| 53.6 | 0 |
| 53.64 | 0 |
| 53.68 | 0 |
| 53.72 | 0 |
| 53.76 | 0 |
| 53.8 | 0 |
| 53.84 | 0 |
| 53.88 | 0 |
| 53.92 | 0 |
| 53.96 | 0 |
| 54.0 | 0 |
| 54.04 | 0 |
| 54.08 | 0 |
| 54.12 | 0 |
| 54.16 | 0 |
| 54.2 | 0 |
| 54.24 | 0 |
| 54.28 | 0 |
| 54.32 | 0 |
| 54.36 | 0 |
| 54.4 | 0 |
| 54.44 | 0 |
| 54.48 | 0 |
| 54.52 | 0 |
| 54.56 | 0 |
| 54.6 | 0 |
| 54.64 | 0 |
| 54.68 | 0 |
| 54.72 | 0 |
| 54.76 | 0 |
| 54.8 | 0 |
| 54.84 | 0 |
| 54.88 | 0 |
| 54.92 | 0 |
| 54.96 | 0 |
| 55.0 | 0 |
| 55.04 | 0 |
| 55.08 | 0 |
| 55.12 | 0 |
| 55.16 | 0 |
| 55.2 | 0 |
| 55.24 | 0 |
| 55.28 | 0 |
| 55.32 | 0 |
| 55.36 | 0 |
| 55.4 | 0 |
| 55.44 | 0 |
| 55.48 | 0 |
| 55.52 | 0 |
| 55.56 | 0 |
| 55.6 | 0 |
| 55.64 | 0 |
| 55.68 | 0 |
| 55.72 | 0 |
| 55.76 | 0 |
| 55.8 | 0 |
| 55.84 | 0 |
| 55.88 | 0 |
| 55.92 | 0 |
| 55.96 | 0 |
| 56.0 | 0 |
| 56.04 | 0 |
| 56.08 | 0 |
| 56.12 | 0 |
| 56.16 | 0 |
| 56.2 | 0 |
| 56.24 | 0 |
| 56.28 | 0 |
| 56.32 | 0 |
| 56.36 | 0 |
| 56.4 | 0 |
| 56.44 | 0 |
| 56.48 | 0 |
| 56.52 | 0 |
| 56.56 | 0 |
| 56.6 | 0 |
| 56.64 | 0 |
| 56.68 | 0 |
| 56.72 | 0 |
| 56.76 | 0 |
| 56.8 | 0 |
| 56.84 | 0 |
| 56.88 | 0 |
| 56.92 | 0 |
| 56.96 | 0 |
| 57.0 | 0 |
| 57.04 | 0 |
| 57.08 | 0 |
| 57.12 | 0 |
| 57.16 | 0 |
| 57.2 | 0 |
| 57.24 | 0 |
| 57.28 | 0 |
| 57.32 | 0 |
| 57.36 | 0 |
| 57.4 | 0 |
| 57.44 | 0 |
| 57.48 | 0 |
| 57.52 | 0 |
| 57.56 | 0 |
| 57.6 | 0 |
| 57.64 | 0 |
| 57.68 | 0 |
| 57.72 | 0 |
| 57.76 | 0 |
| 57.8 | 0 |
| 57.84 | 0 |
| 57.88 | 0 |
| 57.92 | 0 |
| 57.96 | 0 |
| 58.0 | 0 |
| 58.04 | 0 |
| 58.08 | 0 |
| 58.12 | 0 |
| 58.16 | 0 |
| 58.2 | 0 |
| 58.24 | 0 |
| 58.28 | 0 |
| 58.32 | 0 |
| 58.36 | 0 |
| 58.4 | 0 |
| 58.44 | 0 |
| 58.48 | 0 |
| 58.52 | 0 |
| 58.56 | 0 |
| 58.6 | 0 |
| 58.64 | 0 |
| 58.68 | 0 |
| 58.72 | 0 |
| 58.76 | 0 |
| 58.8 | 0 |
| 58.84 | 0 |
| 58.88 | 0 |
| 58.92 | 0 |
| 58.96 | 0 |
| 59.0 | 0 |
| 59.04 | 0 |
| 59.08 | 0 |
| 59.12 | 0 |
| 59.16 | 0 |
| 59.2 | 0 |
| 59.24 | 0 |
| 59.28 | 0 |
| 59.32 | 0 |
| 59.36 | 0 |
| 59.4 | 0 |
| 59.44 | 0 |
| 59.48 | 0 |
| 59.52 | 0 |
| 59.56 | 0 |
| 59.6 | 0 |
| 59.64 | 0 |
| 59.68 | 0 |
| 59.72 | 0 |
| 59.76 | 0 |
| 59.8 | 0 |
| 59.84 | 0 |
| 59.88 | 0 |
| 59.92 | 0 |
| 59.96 | 0 |
| 60.0 | 0 |
| 60.04 | 0 |
| 60.08 | 0 |
| 60.12 | 0 |
| 60.16 | 0 |
| 60.2 | 0 |
| 60.24 | 0 |
| 60.28 | 0 |
| 60.32 | 0 |
| 60.36 | 0 |
| 60.4 | 0 |
| 60.44 | 0 |
| 60.48 | 0 |
| 60.52 | 0 |
| 60.56 | 0 |
| 60.6 | 0 |
| 60.64 | 0 |
| 60.68 | 0 |
| 60.72 | 0 |
| 60.76 | 0 |
| 60.8 | 0 |
| 60.84 | 0 |
| 60.88 | 0 |
| 60.92 | 0 |
| 60.96 | 0 |
| 61.0 | 0 |
| 61.04 | 0 |
| 61.08 | 0 |
| 61.12 | 0 |
| 61.16 | 0 |
| 61.2 | 0 |
| 61.24 | 0 |
| 61.28 | 0 |
| 61.32 | 0 |
| 61.36 | 0 |
| 61.4 | 0 |
| 61.44 | 0 |
| 61.48 | 0 |
| 61.52 | 0 |
| 61.56 | 0 |
| 61.6 | 0 |
| 61.64 | 0 |
| 61.68 | 0 |
| 61.72 | 0 |
| 61.76 | 0 |
| 61.8 | 0 |
| 61.84 | 0 |
| 61.88 | 0 |
| 61.92 | 0 |
| 61.96 | 0 |
| 62.0 | 0 |
| 62.04 | 0 |
| 62.08 | 0 |
| 62.12 | 0 |
| 62.16 | 0 |
| 62.2 | 0 |
| 62.24 | 0 |
| 62.28 | 0 |
| 62.32 | 0 |
| 62.36 | 0 |
| 62.4 | 0 |
| 62.44 | 0 |
| 62.48 | 0 |
| 62.52 | 0 |
| 62.56 | 0 |
| 62.6 | 0 |
| 62.64 | 0 |
| 62.68 | 0 |
| 62.72 | 0 |
| 62.76 | 0 |
| 62.8 | 0 |
| 62.84 | 0 |
| 62.88 | 0 |
| 62.92 | 0 |
| 62.96 | 0 |
| 63.0 | 0 |
| 63.04 | 0 |
| 63.08 | 0 |
| 63.12 | 0 |
| 63.16 | 0 |
| 63.2 | 0 |
| 63.24 | 0 |
| 63.28 | 0 |
| 63.32 | 0 |
| 63.36 | 0 |
| 63.4 | 0 |
| 63.44 | 0 |
| 63.48 | 0 |
| 63.52 | 0 |
| 63.56 | 0 |
| 63.6 | 0 |
| 63.64 | 0 |
| 63.68 | 0 |
| 63.72 | 0 |
| 63.76 | 0 |
| 63.8 | 0 |
| 63.84 | 0 |
| 63.88 | 0 |
| 63.92 | 0 |
| 63.96 | 0 |
| 64.0 | 0 |
| 64.04 | 0 |
| 64.08 | 0 |
| 64.12 | 0 |
| 64.16 | 0 |
| 64.2 | 0 |
| 64.24 | 0 |
| 64.28 | 0 |
| 64.32 | 0 |
| 64.36 | 0 |
| 64.4 | 0 |
| 64.44 | 0 |
| 64.48 | 0 |
| 64.52 | 0 |
| 64.56 | 0 |
| 64.6 | 0 |
| 64.64 | 0 |
| 64.68 | 0 |
| 64.72 | 0 |
| 64.76 | 0 |
| 64.8 | 0 |
| 64.84 | 0 |
| 64.88 | 0 |
| 64.92 | 0 |
| 64.96 | 0 |
| 65.0 | 0 |
| 65.04 | 0 |
| 65.08 | 0 |
| 65.12 | 0 |
| 65.16 | 0 |
| 65.2 | 0 |
| 65.24 | 0 |
| 65.28 | 0 |
| 65.32 | 0 |
| 65.36 | 0 |
| 65.4 | 0 |
| 65.44 | 0 |
| 65.48 | 0 |
| 65.52 | 0 |
| 65.56 | 0 |
| 65.6 | 0 |
| 65.64 | 0 |
| 65.68 | 0 |
| 65.72 | 0 |
| 65.76 | 0 |
| 65.8 | 0 |
| 65.84 | 0 |
| 65.88 | 0 |
| 65.92 | 0 |
| 65.96 | 0 |
| 66.0 | 0 |
| 66.04 | 0 |
| 66.08 | 0 |
| 66.12 | 0 |
| 66.16 | 0 |
| 66.2 | 0 |
| 66.24 | 0 |
| 66.28 | 0 |
| 66.32 | 0 |
| 66.36 | 0 |
| 66.4 | 0 |
| 66.44 | 0 |
| 66.48 | 0 |
| 66.52 | 0 |
| 66.56 | 0 |
| 66.6 | 0 |
| 66.64 | 0 |
| 66.68 | 0 |
| 66.72 | 0 |
| 66.76 | 0 |
| 66.8 | 0 |
| 66.84 | 0 |
| 66.88 | 0 |
| 66.92 | 0 |
| 66.96 | 0 |
| 67.0 | 0 |
| 67.04 | 0 |
| 67.08 | 0 |
| 67.12 | 0 |
| 67.16 | 0 |
| 67.2 | 0 |
| 67.24 | 0 |
| 67.28 | 0 |
| 67.32 | 0 |
| 67.36 | 0 |
| 67.4 | 0 |
| 67.44 | 0 |
| 67.48 | 0 |
| 67.52 | 0 |
| 67.56 | 0 |
| 67.6 | 0 |
| 67.64 | 0 |
| 67.68 | 0 |
| 67.72 | 0 |
| 67.76 | 0 |
| 67.8 | 0 |
| 67.84 | 0 |
| 67.88 | 0 |
| 67.92 | 0 |
| 67.96 | 0 |
| 68.0 | 0 |
| 68.04 | 0 |
| 68.08 | 0 |
| 68.12 | 0 |
| 68.16 | 0 |
| 68.2 | 0 |
| 68.24 | 0 |
| 68.28 | 0 |
| 68.32 | 0 |
| 68.36 | 0 |
| 68.4 | 0 |
| 68.44 | 0 |
| 68.48 | 0 |
| 68.52 | 0 |
| 68.56 | 0 |
| 68.6 | 0 |
| 68.64 | 0 |
| 68.68 | 0 |
| 68.72 | 0 |
| 68.76 | 0 |
| 68.8 | 0 |
| 68.84 | 0 |
| 68.88 | 0 |
| 68.92 | 0 |
| 68.96 | 0 |
| 69.0 | 0 |
| 69.04 | 0 |
| 69.08 | 0 |
| 69.12 | 0 |
| 69.16 | 0 |
| 69.2 | 0 |
| 69.24 | 0 |
| 69.28 | 0 |
| 69.32 | 0 |
| 69.36 | 0 |
| 69.4 | 0 |
| 69.44 | 0 |
| 69.48 | 0 |
| 69.52 | 0 |
| 69.56 | 0 |
| 69.6 | 0 |
| 69.64 | 0 |
| 69.68 | 0 |
| 69.72 | 0 |
| 69.76 | 0 |
| 69.8 | 0 |
| 69.84 | 0 |
| 69.88 | 0 |
| 69.92 | 0 |
| 69.96 | 0 |
| 70.0 | 0 |
| 70.04 | 0 |
| 70.08 | 0 |
| 70.12 | 0 |
| 70.16 | 0 |
| 70.2 | 0 |
| 70.24 | 0 |
| 70.28 | 0 |
| 70.32 | 0 |
| 70.36 | 0 |
| 70.4 | 0 |
| 70.44 | 0 |
| 70.48 | 0 |
| 70.52 | 0 |
| 70.56 | 0 |
| 70.6 | 0 |
| 70.64 | 0 |
| 70.68 | 0 |
| 70.72 | 0 |
| 70.76 | 0 |
| 70.8 | 0 |
| 70.84 | 0 |
| 70.88 | 0 |
| 70.92 | 0 |
| 70.96 | 0 |
| 71.0 | 0 |
| 71.04 | 0 |
| 71.08 | 0 |
| 71.12 | 0 |
| 71.16 | 0 |
| 71.2 | 0 |
| 71.24 | 0 |
| 71.28 | 0 |
| 71.32 | 0 |
| 71.36 | 0 |
| 71.4 | 0 |
| 71.44 | 0 |
| 71.48 | 0 |
| 71.52 | 0 |
| 71.56 | 0 |
| 71.6 | 0 |
| 71.64 | 0 |
| 71.68 | 0 |
| 71.72 | 0 |
| 71.76 | 0 |
| 71.8 | 0 |
| 71.84 | 0 |
| 71.88 | 0 |
| 71.92 | 0 |
| 71.96 | 0 |
| 72.0 | 0 |
| 72.04 | 0 |
| 72.08 | 0 |
| 72.12 | 0 |
| 72.16 | 0 |
| 72.2 | 0 |
| 72.24 | 0 |
| 72.28 | 0 |
| 72.32 | 0 |
| 72.36 | 0 |
| 72.4 | 0 |
| 72.44 | 0 |
| 72.48 | 0 |
| 72.52 | 0 |
| 72.56 | 0 |
| 72.6 | 0 |
| 72.64 | 0 |
| 72.68 | 0 |
| 72.72 | 0 |
| 72.76 | 0 |
| 72.8 | 0 |
| 72.84 | 0 |
| 72.88 | 0 |
| 72.92 | 0 |
| 72.96 | 0 |
| 73.0 | 0 |
| 73.04 | 0 |
| 73.08 | 0 |
| 73.12 | 0 |
| 73.16 | 0 |
| 73.2 | 0 |
| 73.24 | 0 |
| 73.28 | 0 |
| 73.32 | 0 |
| 73.36 | 0 |
| 73.4 | 0 |
| 73.44 | 0 |
| 73.48 | 0 |
| 73.52 | 0 |
| 73.56 | 0 |
| 73.6 | 0 |
| 73.64 | 0 |
| 73.68 | 0 |
| 73.72 | 0 |
| 73.76 | 0 |
| 73.8 | 0 |
| 73.84 | 0 |
| 73.88 | 0 |
| 73.92 | 0 |
| 73.96 | 0 |
| 74.0 | 0 |
| 74.04 | 0 |
| 74.08 | 0 |
| 74.12 | 0 |
| 74.16 | 0 |
| 74.2 | 0 |
| 74.24 | 0 |
| 74.28 | 0 |
| 74.32 | 0 |
| 74.36 | 0 |
| 74.4 | 0 |
| 74.44 | 0 |
| 74.48 | 0 |
| 74.52 | 0 |
| 74.56 | 0 |
| 74.6 | 0 |
| 74.64 | 0 |
| 74.68 | 0 |
| 74.72 | 0 |
| 74.76 | 0 |
| 74.8 | 0 |
| 74.84 | 0 |
| 74.88 | 0 |
| 74.92 | 0 |
| 74.96 | 0 |
| 75.0 | 0 |
| 75.04 | 0 |
| 75.08 | 0 |
| 75.12 | 0 |
| 75.16 | 0 |
| 75.2 | 0 |
| 75.24 | 0 |
| 75.28 | 0 |
| 75.32 | 0 |
| 75.36 | 0 |
| 75.4 | 0 |
| 75.44 | 0 |
| 75.48 | 0 |
| 75.52 | 0 |
| 75.56 | 0 |
| 75.6 | 0 |
| 75.64 | 0 |
| 75.68 | 0 |
| 75.72 | 0 |
| 75.76 | 0 |
| 75.8 | 0 |
| 75.84 | 0 |
| 75.88 | 0 |
| 75.92 | 0 |
| 75.96 | 0 |
| 76.0 | 0 |
| 76.04 | 0 |
| 76.08 | 0 |
| 76.12 | 0 |
| 76.16 | 0 |
| 76.2 | 0 |
| 76.24 | 0 |
| 76.28 | 0 |
| 76.32 | 0 |
| 76.36 | 0 |
| 76.4 | 0 |
| 76.44 | 0 |
| 76.48 | 0 |
| 76.52 | 0 |
| 76.56 | 0 |
| 76.6 | 0 |
| 76.64 | 0 |
| 76.68 | 0 |
| 76.72 | 0 |
| 76.76 | 0 |
| 76.8 | 0 |
| 76.84 | 0 |
| 76.88 | 0 |
| 76.92 | 0 |
| 76.96 | 0 |
| 77.0 | 0 |
| 77.04 | 0 |
| 77.08 | 0 |
| 77.12 | 0 |
| 77.16 | 0 |
| 77.2 | 0 |
| 77.24 | 0 |
| 77.28 | 0 |
| 77.32 | 0 |
| 77.36 | 0 |
| 77.4 | 0 |
| 77.44 | 0 |
| 77.48 | 0 |
| 77.52 | 0 |
| 77.56 | 0 |
| 77.6 | 0 |
| 77.64 | 0 |
| 77.68 | 0 |
| 77.72 | 0 |
| 77.76 | 0 |
| 77.8 | 0 |
| 77.84 | 0 |
| 77.88 | 0 |
| 77.92 | 0 |
| 77.96 | 0 |
| 78.0 | 0 |
| 78.04 | 0 |
| 78.08 | 0 |
| 78.12 | 0 |
| 78.16 | 0 |
| 78.2 | 0 |
| 78.24 | 0 |
| 78.28 | 0 |
| 78.32 | 0 |
| 78.36 | 0 |
| 78.4 | 0 |
| 78.44 | 0 |
| 78.48 | 0 |
| 78.52 | 0 |
| 78.56 | 0 |
| 78.6 | 0 |
| 78.64 | 0 |
| 78.68 | 0 |
| 78.72 | 0 |
| 78.76 | 0 |
| 78.8 | 0 |
| 78.84 | 0 |
| 78.88 | 0 |
| 78.92 | 0 |
| 78.96 | 0 |
| 79.0 | 0 |
| 79.04 | 0 |
| 79.08 | 0 |
| 79.12 | 0 |
| 79.16 | 0 |
| 79.2 | 0 |
| 79.24 | 0 |
| 79.28 | 0 |
| 79.32 | 0 |
| 79.36 | 0 |
| 79.4 | 0 |
| 79.44 | 0 |
| 79.48 | 0 |
| 79.52 | 0 |
| 79.56 | 0 |
| 79.6 | 0 |
| 79.64 | 0 |
| 79.68 | 0 |
| 79.72 | 0 |
| 79.76 | 0 |
| 79.8 | 0 |
| 79.84 | 0 |
| 79.88 | 0 |
| 79.92 | 0 |
| 79.96 | 0 |
| 80.0 | 0 |
| 80.04 | 0 |
| 80.08 | 0 |
| 80.12 | 0 |
| 80.16 | 0 |
| 80.2 | 0 |
| 80.24 | 0 |
| 80.28 | 0 |
| 80.32 | 0 |
| 80.36 | 0 |
| 80.4 | 0 |
| 80.44 | 0 |
| 80.48 | 0 |
| 80.52 | 0 |
| 80.56 | 0 |
| 80.6 | 0 |
| 80.64 | 0 |
| 80.68 | 0 |
| 80.72 | 0 |
| 80.76 | 0 |
| 80.8 | 0 |
| 80.84 | 0 |
| 80.88 | 0 |
| 80.92 | 0 |
| 80.96 | 0 |
| 81.0 | 0 |
| 81.04 | 0 |
| 81.08 | 0 |
| 81.12 | 0 |
| 81.16 | 0 |
| 81.2 | 0 |
| 81.24 | 0 |
| 81.28 | 0 |
| 81.32 | 0 |
| 81.36 | 0 |
| 81.4 | 0 |
| 81.44 | 0 |
| 81.48 | 0 |
| 81.52 | 0 |
| 81.56 | 0 |
| 81.6 | 0 |
| 81.64 | 0 |
| 81.68 | 0 |
| 81.72 | 0 |
| 81.76 | 0 |
| 81.8 | 0 |
| 81.84 | 0 |
| 81.88 | 0 |